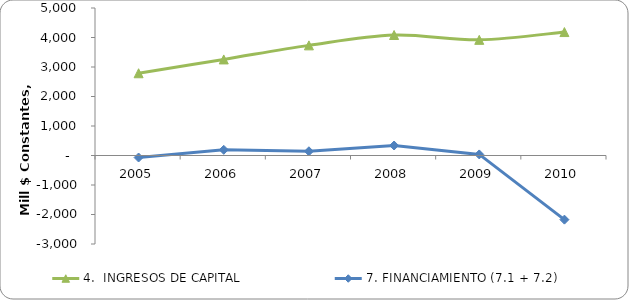
| Category | 4.  INGRESOS DE CAPITAL | 7. FINANCIAMIENTO (7.1 + 7.2) |
|---|---|---|
| 2005 | 2787.62 | -68.052 |
| 2006 | 3256.587 | 192.288 |
| 2007 | 3733.258 | 143.131 |
| 2008 | 4084.339 | 338.58 |
| 2009 | 3920.192 | 36.272 |
| 2010 | 4184.403 | -2174.074 |